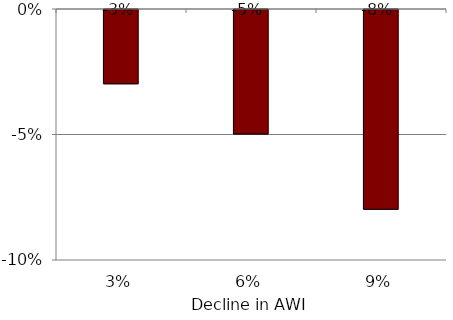
| Category | Series 1 |
|---|---|
| 0.03 | -0.03 |
| 0.06 | -0.05 |
| 0.09 | -0.08 |